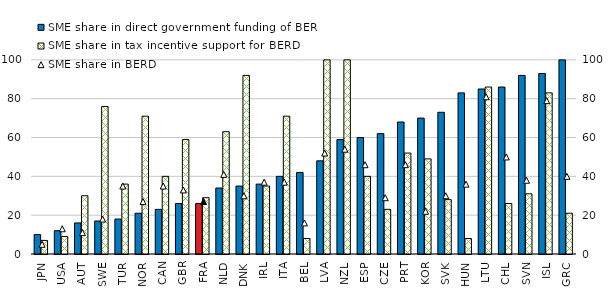
| Category | SME share in direct government funding of BERD | SME share in tax incentive support for BERD |
|---|---|---|
| JPN | 10 | 7 |
| USA | 12 | 9 |
| AUT | 16 | 30 |
| SWE | 17 | 76 |
| TUR | 18 | 36 |
| NOR | 21 | 71 |
| CAN | 23 | 40 |
| GBR | 26 | 59 |
| FRA | 26 | 29 |
| NLD | 34 | 63 |
| DNK | 35 | 92 |
| IRL | 36 | 35 |
| ITA | 40 | 71 |
| BEL | 42 | 8 |
| LVA | 48 | 100 |
| NZL | 59 | 100 |
| ESP | 60 | 40 |
| CZE | 62 | 23 |
| PRT | 68 | 52 |
| KOR | 70 | 49 |
| SVK | 73 | 28 |
| HUN | 83 | 8 |
| LTU | 85 | 86 |
| CHL | 86 | 26 |
| SVN | 92 | 31 |
| ISL | 93 | 83 |
| GRC | 100 | 21 |